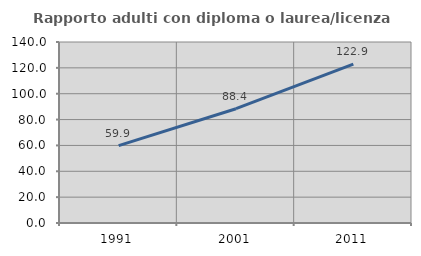
| Category | Rapporto adulti con diploma o laurea/licenza media  |
|---|---|
| 1991.0 | 59.864 |
| 2001.0 | 88.411 |
| 2011.0 | 122.898 |